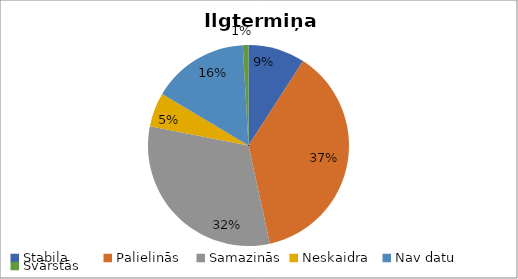
| Category | Ilgtermiņa (visi) |
|---|---|
| Stabila | 20 |
| Palielinās | 82 |
| Samazinās | 69 |
| Neskaidra | 12 |
| Nav datu | 34 |
| Svārstās | 2 |